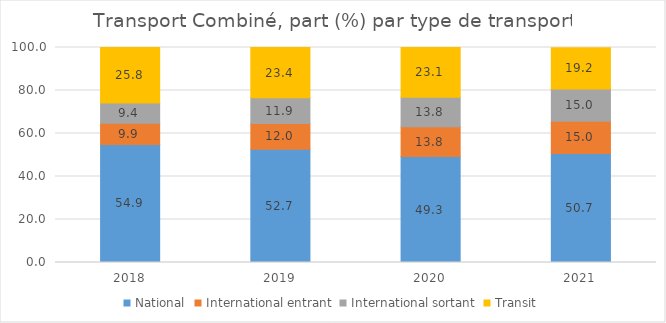
| Category | National | International entrant | International sortant | Transit |
|---|---|---|---|---|
| 2018.0 | 54.9 | 9.9 | 9.4 | 25.8 |
| 2019.0 | 52.7 | 12 | 11.9 | 23.4 |
| 2020.0 | 49.3 | 13.8 | 13.8 | 23.1 |
| 2021.0 | 50.7 | 15 | 15 | 19.2 |